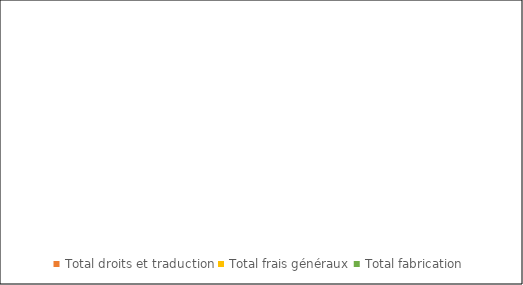
| Category | Series 0 |
|---|---|
| Total droits et traduction | 0 |
| Total frais généraux | 0 |
| Total fabrication | 0 |